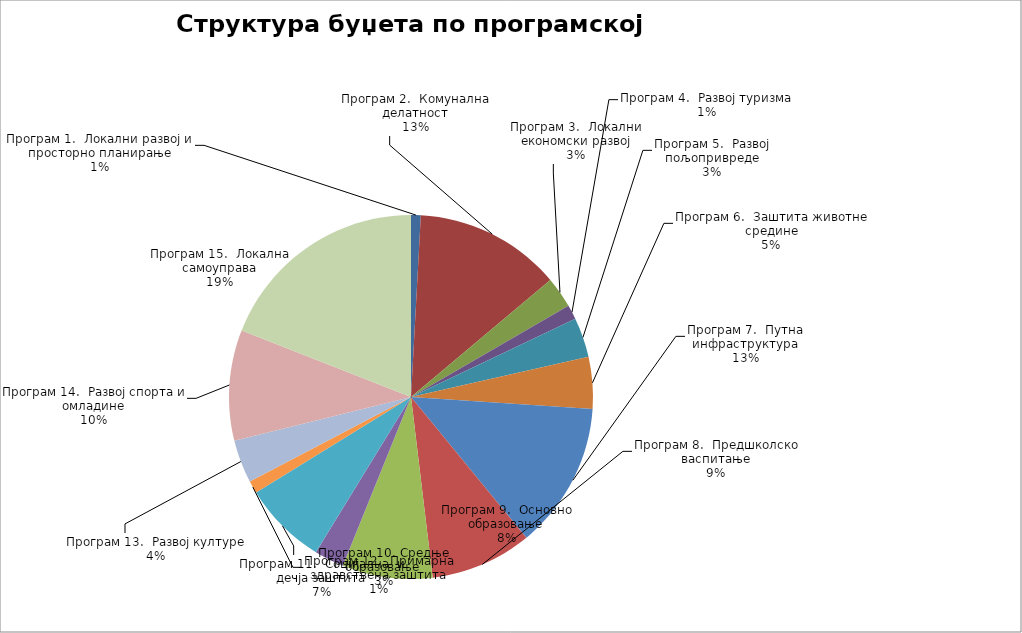
| Category | Series 0 |
|---|---|
| Програм 1.  Локални развој и просторно планирање | 7000000 |
| Програм 2.  Комунална делатност | 105870000 |
| Програм 3.  Локални економски развој | 22540000 |
| Програм 4.  Развој туризма | 10350000 |
| Програм 5.  Развој пољопривреде | 28800000 |
| Програм 6.  Заштита животне средине | 37430000 |
| Програм 7.  Путна инфраструктура | 105900000 |
| Програм 8.  Предшколско васпитање | 73400000 |
| Програм 9.  Основно образовање | 65200000 |
| Програм 10. Средње образовање | 21500000 |
| Програм 11.  Социјална  и дечја заштита | 60650000 |
| Програм 12.  Примарна здравствена заштита | 9000000 |
| Програм 13.  Развој културе | 31100000 |
| Програм 14.  Развој спорта и омладине | 79882359 |
| Програм 15.  Локална самоуправа | 154897641 |